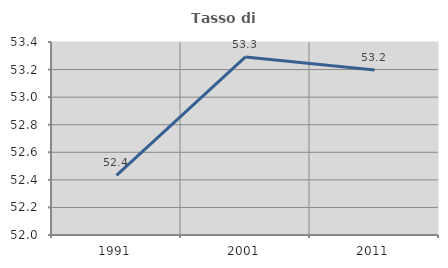
| Category | Tasso di occupazione   |
|---|---|
| 1991.0 | 52.432 |
| 2001.0 | 53.292 |
| 2011.0 | 53.197 |